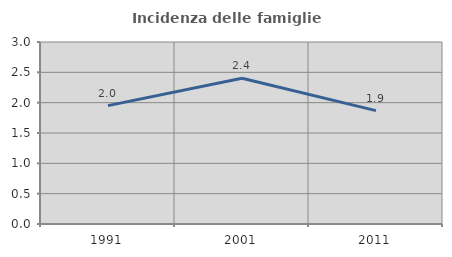
| Category | Incidenza delle famiglie numerose |
|---|---|
| 1991.0 | 1.951 |
| 2001.0 | 2.402 |
| 2011.0 | 1.869 |